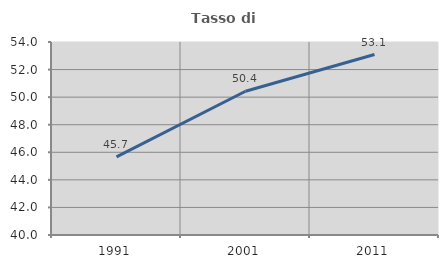
| Category | Tasso di occupazione   |
|---|---|
| 1991.0 | 45.673 |
| 2001.0 | 50.427 |
| 2011.0 | 53.09 |